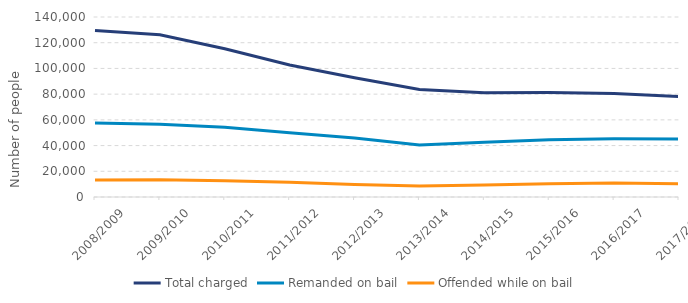
| Category | Total charged | Remanded on bail | Offended while on bail |
|---|---|---|---|
| 2008/2009 | 129574 | 57515 | 13228 |
| 2009/2010 | 126189 | 56551 | 13491 |
| 2010/2011 | 115264 | 54190 | 12572 |
| 2011/2012 | 102711 | 50020 | 11532 |
| 2012/2013 | 92681 | 45799 | 9720 |
| 2013/2014 | 83619 | 40434 | 8517 |
| 2014/2015 | 81113 | 42588 | 9339 |
| 2015/2016 | 81364 | 44468 | 10278 |
| 2016/2017 | 80531 | 45269 | 10974 |
| 2017/2018 | 78100 | 45122 | 10349 |